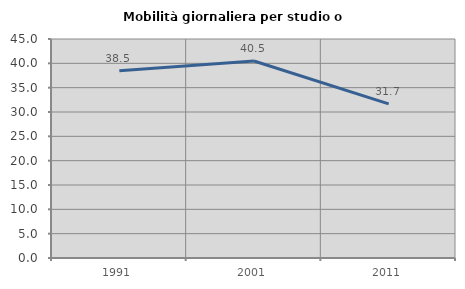
| Category | Mobilità giornaliera per studio o lavoro |
|---|---|
| 1991.0 | 38.462 |
| 2001.0 | 40.476 |
| 2011.0 | 31.667 |